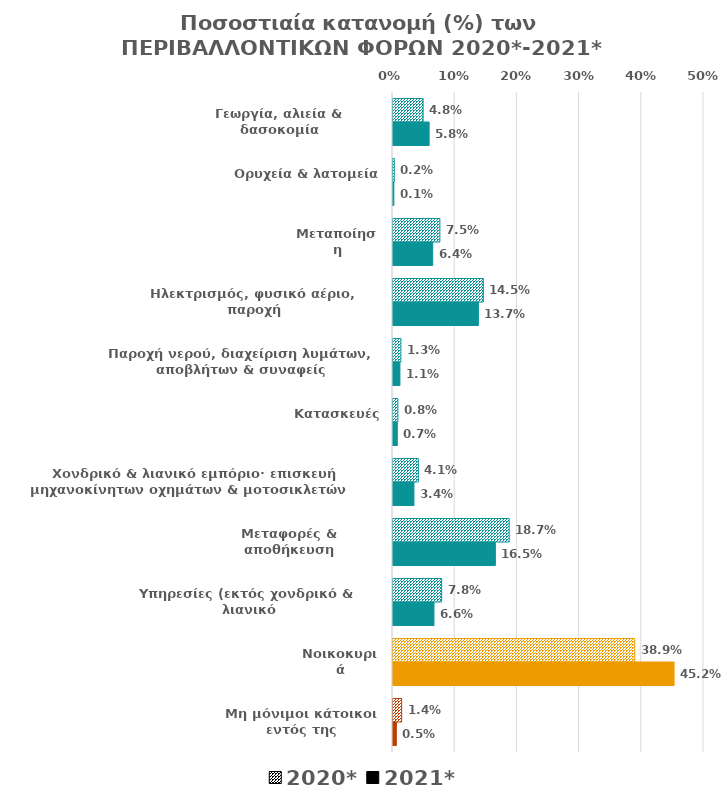
| Category | 2020* | 2021* |
|---|---|---|
| Γεωργία, αλιεία & δασοκομία | 0.048 | 0.058 |
| Ορυχεία & λατομεία  | 0.002 | 0.001 |
| Μεταποίηση | 0.075 | 0.064 |
| Ηλεκτρισμός, φυσικό αέριο, παροχή
ατμού & συναφείς δραστηριότητες   | 0.145 | 0.137 |
| Παροχή νερού, διαχείριση λυμάτων,
αποβλήτων & συναφείς δραστηριότητες | 0.013 | 0.011 |
| Κατασκευές | 0.008 | 0.007 |
| Χονδρικό & λιανικό εμπόριο· επισκευή μηχανοκίνητων οχημάτων & μοτοσικλετών   | 0.041 | 0.034 |
| Μεταφορές & αποθήκευση | 0.187 | 0.165 |
| Υπηρεσίες (εκτός χονδρικό & λιανικό
εμπόριο, μεταφορές & αποθήκευση) | 0.078 | 0.066 |
| Νοικοκυριά | 0.389 | 0.452 |
| Μη μόνιμοι κάτοικοι
εντός της επικράτειας | 0.014 | 0.005 |